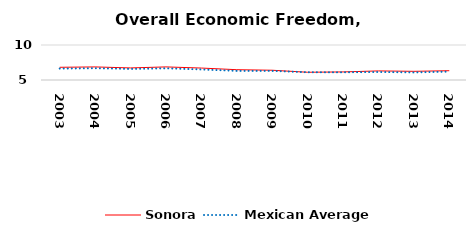
| Category | Sonora | Mexican Average  |
|---|---|---|
| 2003.0 | 6.816 | 6.632 |
| 2004.0 | 6.866 | 6.678 |
| 2005.0 | 6.725 | 6.582 |
| 2006.0 | 6.869 | 6.668 |
| 2007.0 | 6.706 | 6.508 |
| 2008.0 | 6.473 | 6.3 |
| 2009.0 | 6.393 | 6.3 |
| 2010.0 | 6.105 | 6.105 |
| 2011.0 | 6.154 | 6.103 |
| 2012.0 | 6.297 | 6.144 |
| 2013.0 | 6.24 | 6.087 |
| 2014.0 | 6.328 | 6.195 |